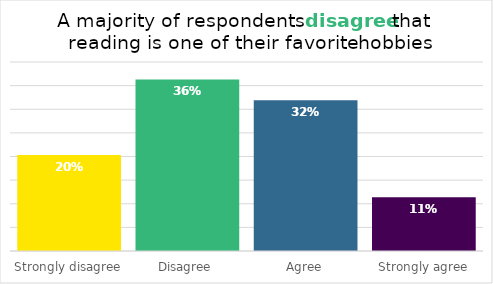
| Category | Series 0 |
|---|---|
| Strongly disagree | 0.203 |
| Disagree | 0.363 |
| Agree | 0.319 |
| Strongly agree | 0.114 |